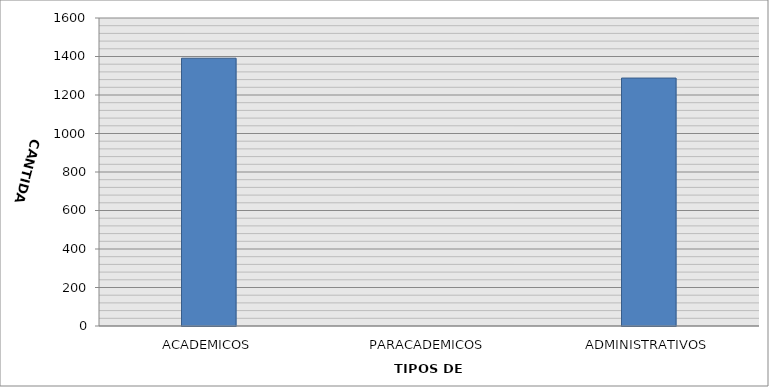
| Category | CANTIDAD |
|---|---|
| ACADEMICOS | 1391 |
| PARACADEMICOS | 0 |
| ADMINISTRATIVOS | 1288 |